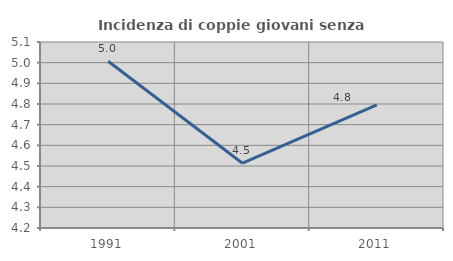
| Category | Incidenza di coppie giovani senza figli |
|---|---|
| 1991.0 | 5.007 |
| 2001.0 | 4.513 |
| 2011.0 | 4.795 |